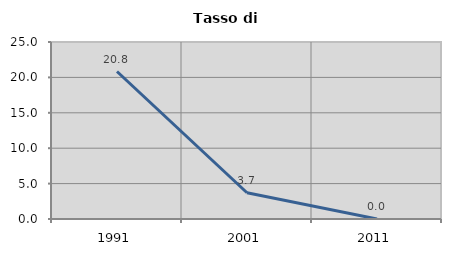
| Category | Tasso di disoccupazione   |
|---|---|
| 1991.0 | 20.833 |
| 2001.0 | 3.704 |
| 2011.0 | 0 |